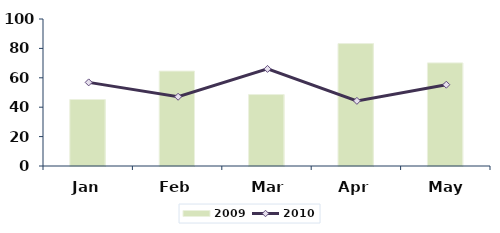
| Category | 2009 |
|---|---|
| Jan | 45.222 |
| Feb | 64.571 |
| Mar | 48.594 |
| Apr | 83.28 |
| May | 70.147 |